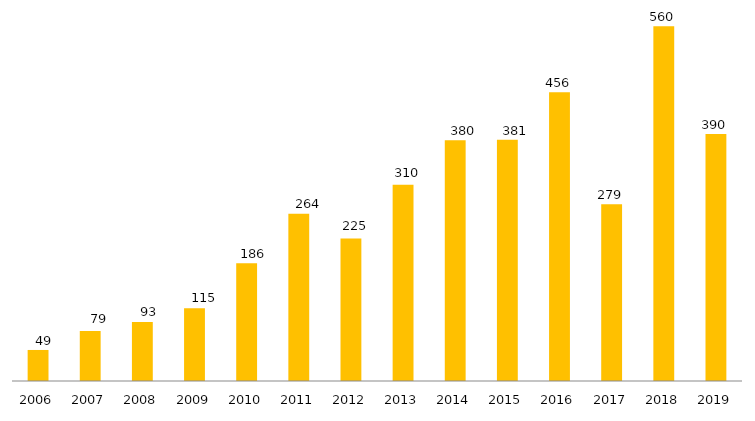
| Category | Pós - Graduação UFGD |
|---|---|
| 2006.0 | 49 |
| 2007.0 | 79 |
| 2008.0 | 93 |
| 2009.0 | 115 |
| 2010.0 | 186 |
| 2011.0 | 264 |
| 2012.0 | 225 |
| 2013.0 | 310 |
| 2014.0 | 380 |
| 2015.0 | 381 |
| 2016.0 | 456 |
| 2017.0 | 279 |
| 2018.0 | 560 |
| 2019.0 | 390 |